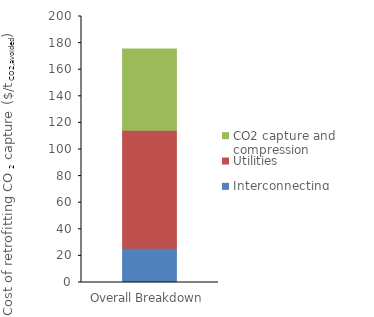
| Category | Interconnecting | Utilities | CO2 capture and compression |
|---|---|---|---|
| 0 | 25.695 | 88.722 | 61.178 |